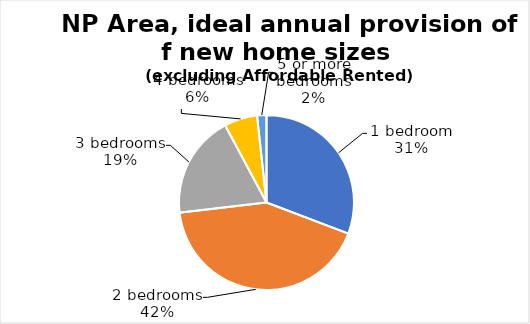
| Category | Series 0 |
|---|---|
| 1 bedroom | 0.308 |
| 2 bedrooms | 0.424 |
| 3 bedrooms | 0.19 |
| 4 bedrooms | 0.061 |
| 5 or more bedrooms | 0.017 |